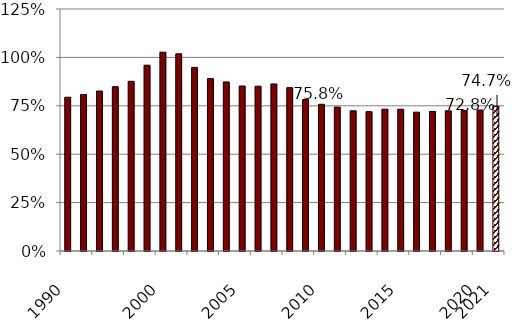
| Category | Series 0 |
|---|---|
| 1990.0 | 0.794 |
| nan | 0.808 |
| nan | 0.826 |
| nan | 0.849 |
| nan | 0.876 |
| nan | 0.96 |
| 2000.0 | 1.027 |
| nan | 1.018 |
| nan | 0.948 |
| nan | 0.89 |
| nan | 0.873 |
| 2005.0 | 0.852 |
| nan | 0.851 |
| nan | 0.863 |
| nan | 0.844 |
| nan | 0.783 |
| 2010.0 | 0.758 |
| nan | 0.743 |
| nan | 0.724 |
| nan | 0.72 |
| nan | 0.733 |
| 2015.0 | 0.732 |
| nan | 0.717 |
| nan | 0.721 |
| nan | 0.724 |
| nan | 0.726 |
| 2020.0 | 0.728 |
| 2021.0 | 0.747 |